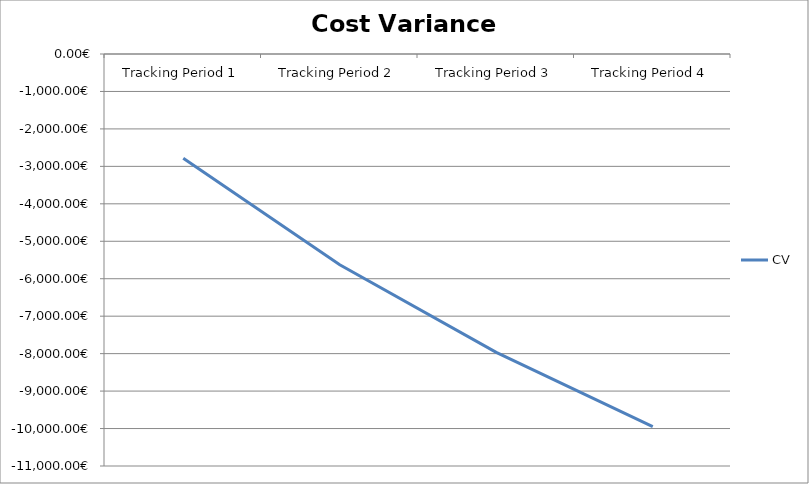
| Category | CV |
|---|---|
| Tracking Period 1 | -2785 |
| Tracking Period 2 | -5628 |
| Tracking Period 3 | -7965 |
| Tracking Period 4 | -9949 |